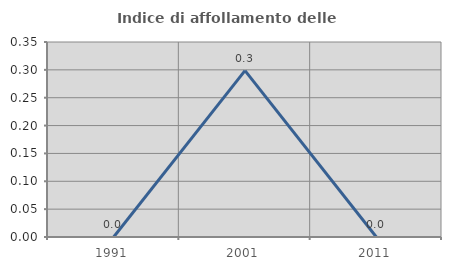
| Category | Indice di affollamento delle abitazioni  |
|---|---|
| 1991.0 | 0 |
| 2001.0 | 0.299 |
| 2011.0 | 0 |